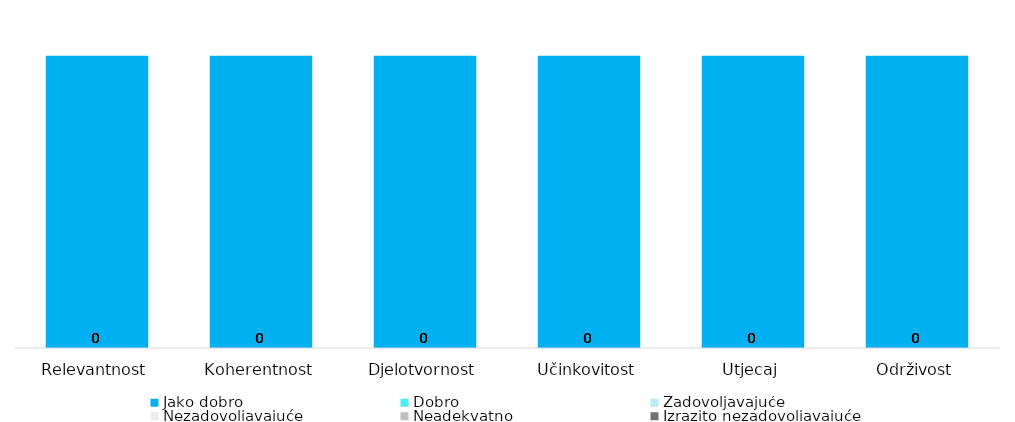
| Category | Jako dobro | Dobro | Zadovoljavajuće | Nezadovoljavajuće | Neadekvatno | Izrazito nezadovoljavajuće |
|---|---|---|---|---|---|---|
| Relevantnost | 6 | 0 | 0 | 0 | 0 | 0 |
| Koherentnost | 6 | 0 | 0 | 0 | 0 | 0 |
| Djelotvornost | 6 | 0 | 0 | 0 | 0 | 0 |
| Učinkovitost | 6 | 0 | 0 | 0 | 0 | 0 |
| Utjecaj | 6 | 0 | 0 | 0 | 0 | 0 |
| Održivost | 6 | 0 | 0 | 0 | 0 | 0 |